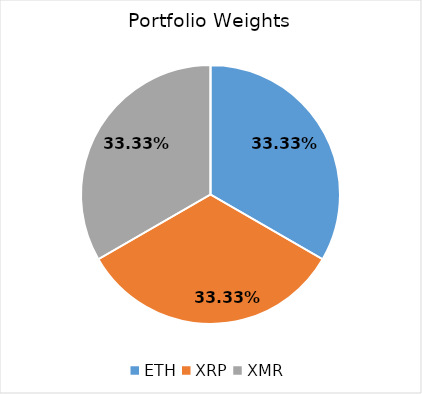
| Category | Series 0 |
|---|---|
| ETH | 0.333 |
| XRP | 0.333 |
| XMR | 0.333 |